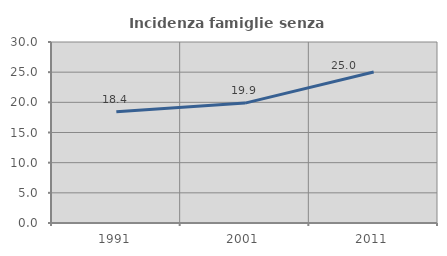
| Category | Incidenza famiglie senza nuclei |
|---|---|
| 1991.0 | 18.434 |
| 2001.0 | 19.875 |
| 2011.0 | 25.019 |